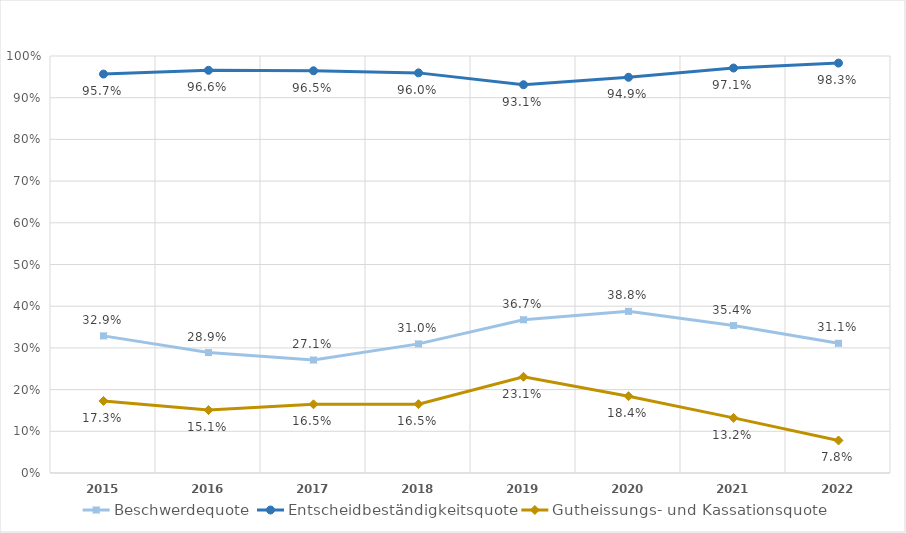
| Category | Beschwerdequote | Entscheidbeständigkeitsquote | Gutheissungs- und Kassationsquote |
|---|---|---|---|
| 2015.0 | 0.329 | 0.957 | 0.173 |
| 2016.0 | 0.289 | 0.966 | 0.151 |
| 2017.0 | 0.271 | 0.965 | 0.165 |
| 2018.0 | 0.31 | 0.96 | 0.165 |
| 2019.0 | 0.367 | 0.931 | 0.231 |
| 2020.0 | 0.388 | 0.949 | 0.184 |
| 2021.0 | 0.354 | 0.971 | 0.132 |
| 2022.0 | 0.311 | 0.983 | 0.078 |